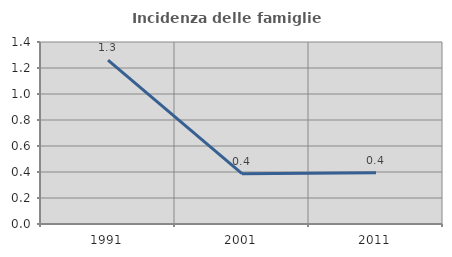
| Category | Incidenza delle famiglie numerose |
|---|---|
| 1991.0 | 1.261 |
| 2001.0 | 0.387 |
| 2011.0 | 0.394 |